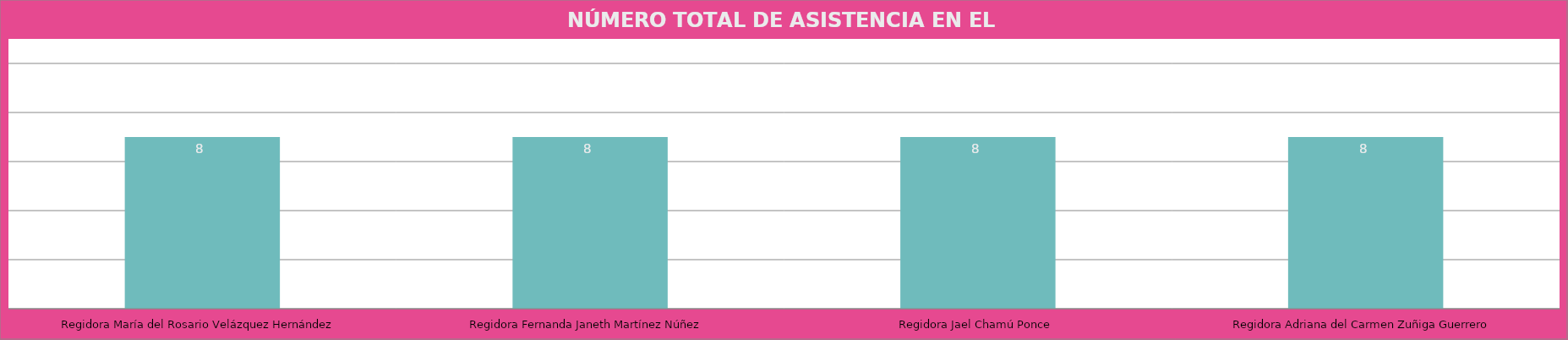
| Category | Regidora María del Rosario Velázquez Hernández |
|---|---|
| Regidora María del Rosario Velázquez Hernández | 8 |
| Regidora Fernanda Janeth Martínez Núñez | 8 |
| Regidora Jael Chamú Ponce | 8 |
| Regidora Adriana del Carmen Zuñiga Guerrero | 8 |